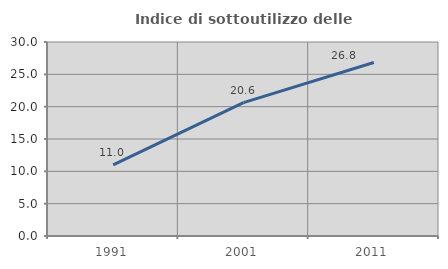
| Category | Indice di sottoutilizzo delle abitazioni  |
|---|---|
| 1991.0 | 11.012 |
| 2001.0 | 20.634 |
| 2011.0 | 26.825 |